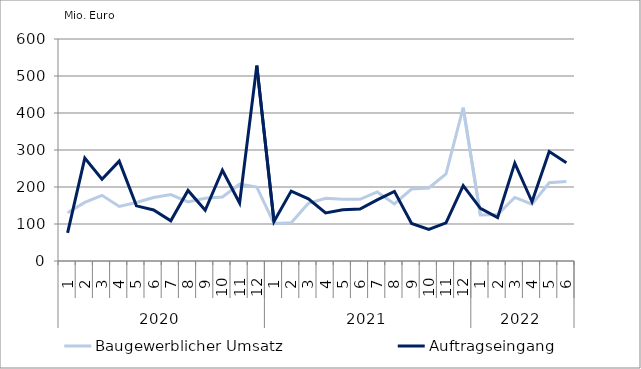
| Category | Baugewerblicher Umsatz | Auftragseingang |
|---|---|---|
| 0 | 130445.562 | 75891.481 |
| 1 | 158433.655 | 277923.85 |
| 2 | 177529.832 | 220973.626 |
| 3 | 147259.799 | 269936.091 |
| 4 | 157965.891 | 149072.895 |
| 5 | 171647.778 | 137984.76 |
| 6 | 179530.732 | 108645.965 |
| 7 | 159480.457 | 190771.468 |
| 8 | 169638.111 | 136988.906 |
| 9 | 173040.053 | 245341.603 |
| 10 | 207619.085 | 156647.224 |
| 11 | 199947.086 | 528166.004 |
| 12 | 101295.895 | 106850.127 |
| 13 | 103236.543 | 188883.434 |
| 14 | 156172.725 | 168204.42 |
| 15 | 169257.088 | 130052.073 |
| 16 | 166897.821 | 138492.214 |
| 17 | 166720.216 | 140262.426 |
| 18 | 186515.191 | 165331.191 |
| 19 | 154188.941 | 188169.655 |
| 20 | 194464.12 | 101359.538 |
| 21 | 197281.201 | 85626.862 |
| 22 | 235325.083 | 102880.924 |
| 23 | 414469.471 | 203900.676 |
| 24 | 124217.549 | 142351.759 |
| 25 | 125619.696 | 117194.423 |
| 26 | 171896.664 | 264509.013 |
| 27 | 153384.654 | 160146.519 |
| 28 | 211335.38 | 295997.826 |
| 29 | 214914.164 | 265813.917 |